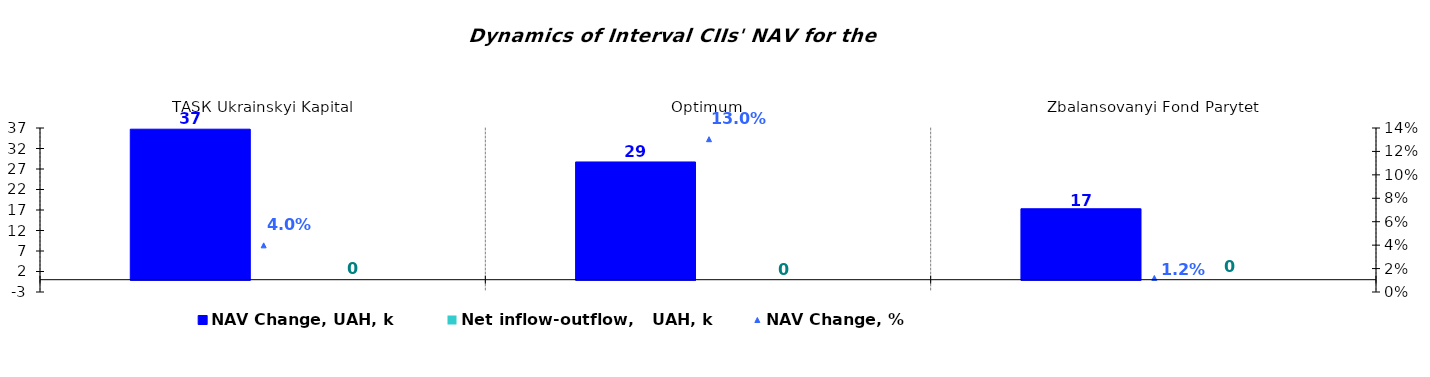
| Category | NAV Change, UAH, k | Net inflow-outflow,   UAH, k |
|---|---|---|
| ТАSК Ukrainskyi Kapital | 36.708 | 0 |
| Optimum | 28.718 | 0 |
| Zbalansovanyi Fond Parytet | 17.302 | 0 |